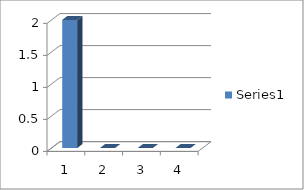
| Category | Series 0 |
|---|---|
| 0 | 2 |
| 1 | 0 |
| 2 | 0 |
| 3 | 0 |